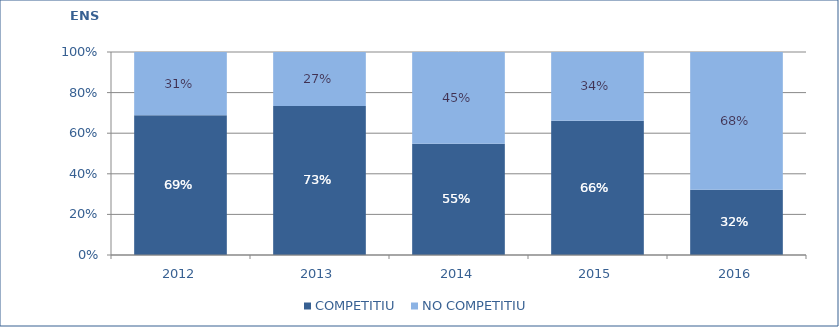
| Category | COMPETITIU  | NO COMPETITIU |
|---|---|---|
| 2012.0 | 0.689 | 0.311 |
| 2013.0 | 0.734 | 0.266 |
| 2014.0 | 0.548 | 0.452 |
| 2015.0 | 0.662 | 0.338 |
| 2016.0 | 0.321 | 0.679 |